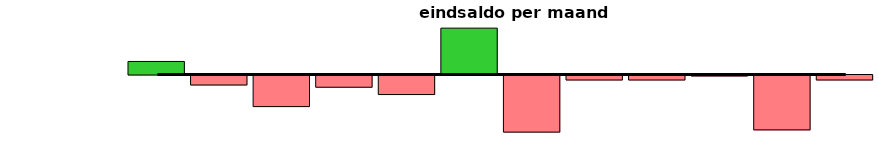
| Category | Series 0 |
|---|---|
|  | 3493.5 |
|  | -2032.5 |
| jan | 784 |
| feb | -601 |
| mrt | -1901 |
| apr | -736 |
| mei | -1176 |
| juni | 2789 |
| juli | -3436 |
| aug | -301 |
| sept | -301 |
| okt | -61 |
| nov | -3301 |
| dec | -301 |